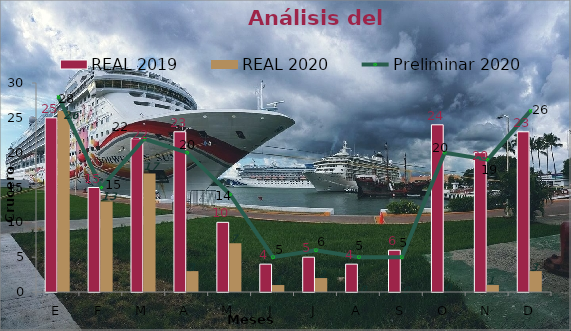
| Category | REAL 2019 | REAL 2020 |
|---|---|---|
| E | 25 | 26 |
| F | 15 | 13 |
| M | 22 | 17 |
| A | 23 | 3 |
| M | 10 | 7 |
| J | 4 | 1 |
| J | 5 | 2 |
| A | 4 | 0 |
| S | 6 | 0 |
| O | 24 | 0 |
| N | 20 | 1 |
| D | 23 | 3 |